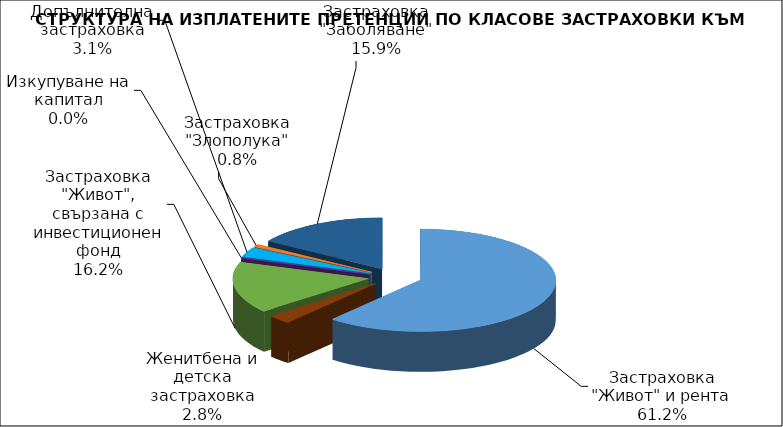
| Category | Застраховка "Живот" и рента |
|---|---|
| Застраховка "Живот" и рента | 123990525.459 |
| Женитбена и детска застраховка | 5752021.969 |
| Застраховка "Живот", свързана с инвестиционен фонд | 32875751.767 |
| Изкупуване на капитал | 0 |
| Допълнителна застраховка | 6247842.2 |
| Застраховка "Злополука" | 1640704.317 |
| Застраховка "Заболяване" | 32194067.71 |